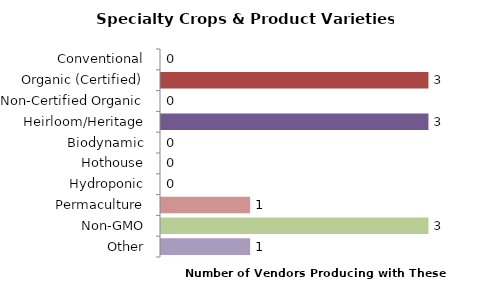
| Category | Series 0 |
|---|---|
| Conventional | 0 |
| Organic (Certified) | 3 |
| Non-Certified Organic | 0 |
| Heirloom/Heritage | 3 |
| Biodynamic | 0 |
| Hothouse | 0 |
| Hydroponic | 0 |
| Permaculture | 1 |
| Non-GMO | 3 |
| Other | 1 |